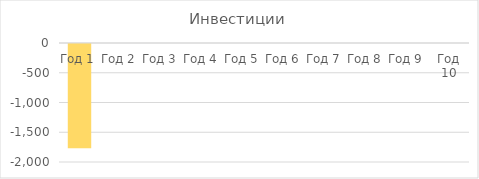
| Category | Инвестиции |
|---|---|
| Год 1 | -1750 |
| Год 2 | 0 |
| Год 3 | 0 |
| Год 4 | 0 |
| Год 5 | 0 |
| Год 6 | 0 |
| Год 7 | 0 |
| Год 8 | 0 |
| Год 9 | 0 |
| Год 10 | 0 |